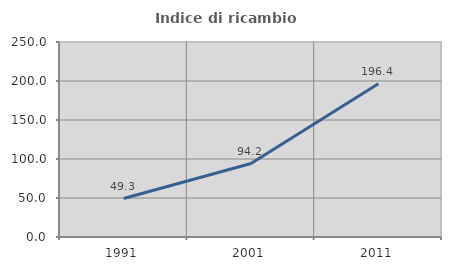
| Category | Indice di ricambio occupazionale  |
|---|---|
| 1991.0 | 49.333 |
| 2001.0 | 94.231 |
| 2011.0 | 196.429 |